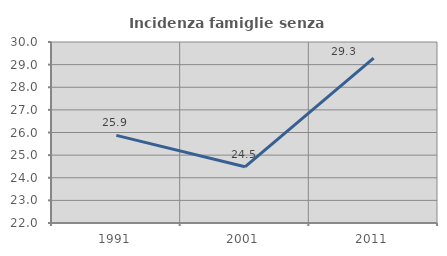
| Category | Incidenza famiglie senza nuclei |
|---|---|
| 1991.0 | 25.873 |
| 2001.0 | 24.485 |
| 2011.0 | 29.292 |